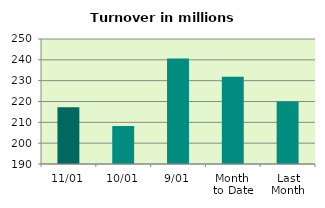
| Category | Series 0 |
|---|---|
| 11/01 | 217.182 |
| 10/01 | 208.227 |
| 9/01 | 240.697 |
| Month 
to Date | 231.824 |
| Last
Month | 219.947 |